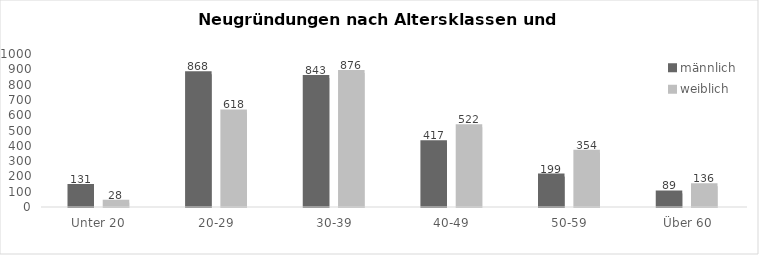
| Category | männlich | weiblich |
|---|---|---|
| Unter 20 | 131 | 28 |
| 20-29 | 868 | 618 |
| 30-39 | 843 | 876 |
| 40-49 | 417 | 522 |
| 50-59 | 199 | 354 |
| Über 60 | 89 | 136 |